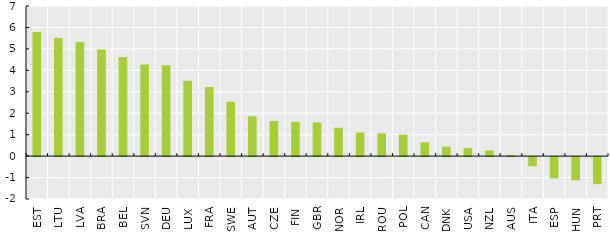
| Category | Series 0 |
|---|---|
| EST | 5.787 |
| LTU | 5.506 |
| LVA | 5.318 |
| BRA | 4.971 |
| BEL | 4.616 |
| SVN | 4.277 |
| DEU | 4.239 |
| LUX | 3.516 |
| FRA | 3.221 |
| SWE | 2.535 |
| AUT | 1.86 |
| CZE | 1.641 |
| FIN | 1.598 |
| GBR | 1.574 |
| NOR | 1.323 |
| IRL | 1.103 |
| ROU | 1.06 |
| POL | 1.001 |
| CAN | 0.64 |
| DNK | 0.44 |
| USA | 0.376 |
| NZL | 0.267 |
| AUS | 0.048 |
| ITA | -0.426 |
| ESP | -0.992 |
| HUN | -1.086 |
| PRT | -1.262 |